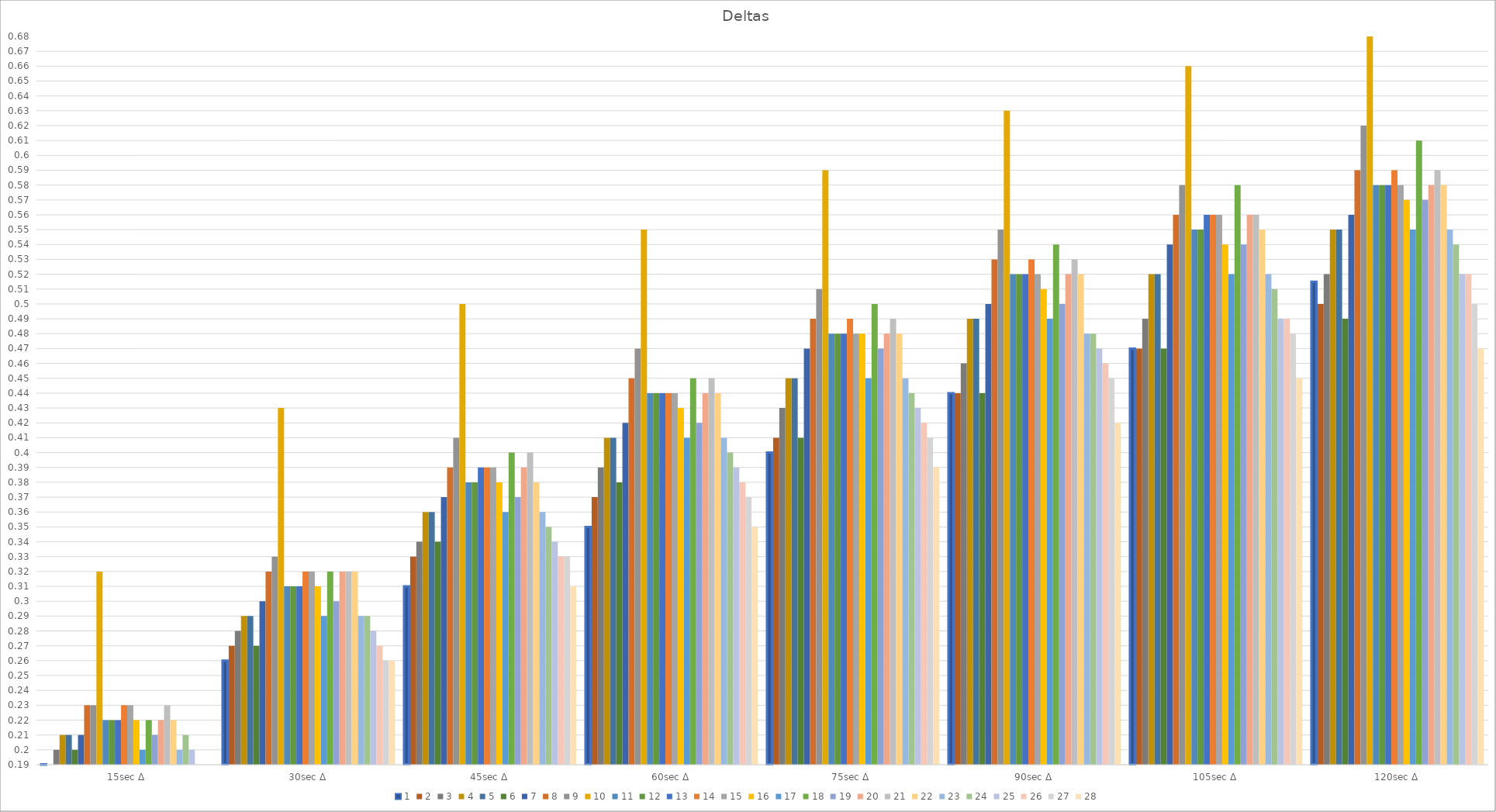
| Category | 1 | 2 | 3 | 4 | 5 | 6 | 7 | 8 | 9 | 10 | 11 | 12 | 13 | 14 | 15 | 16 | 17 | 18 | 19 | 20 | 21 | 22 | 23 | 24 | 25 | 26 | 27 | 28 |
|---|---|---|---|---|---|---|---|---|---|---|---|---|---|---|---|---|---|---|---|---|---|---|---|---|---|---|---|---|
| 15sec Δ | 0.19 | 0.19 | 0.2 | 0.21 | 0.21 | 0.2 | 0.21 | 0.23 | 0.23 | 0.32 | 0.22 | 0.22 | 0.22 | 0.23 | 0.23 | 0.22 | 0.2 | 0.22 | 0.21 | 0.22 | 0.23 | 0.22 | 0.2 | 0.21 | 0.2 | 0.19 | 0.19 | 0.19 |
| 30sec Δ | 0.26 | 0.27 | 0.28 | 0.29 | 0.29 | 0.27 | 0.3 | 0.32 | 0.33 | 0.43 | 0.31 | 0.31 | 0.31 | 0.32 | 0.32 | 0.31 | 0.29 | 0.32 | 0.3 | 0.32 | 0.32 | 0.32 | 0.29 | 0.29 | 0.28 | 0.27 | 0.26 | 0.26 |
| 45sec Δ | 0.31 | 0.33 | 0.34 | 0.36 | 0.36 | 0.34 | 0.37 | 0.39 | 0.41 | 0.5 | 0.38 | 0.38 | 0.39 | 0.39 | 0.39 | 0.38 | 0.36 | 0.4 | 0.37 | 0.39 | 0.4 | 0.38 | 0.36 | 0.35 | 0.34 | 0.33 | 0.33 | 0.31 |
| 60sec Δ | 0.35 | 0.37 | 0.39 | 0.41 | 0.41 | 0.38 | 0.42 | 0.45 | 0.47 | 0.55 | 0.44 | 0.44 | 0.44 | 0.44 | 0.44 | 0.43 | 0.41 | 0.45 | 0.42 | 0.44 | 0.45 | 0.44 | 0.41 | 0.4 | 0.39 | 0.38 | 0.37 | 0.35 |
| 75sec Δ  | 0.4 | 0.41 | 0.43 | 0.45 | 0.45 | 0.41 | 0.47 | 0.49 | 0.51 | 0.59 | 0.48 | 0.48 | 0.48 | 0.49 | 0.48 | 0.48 | 0.45 | 0.5 | 0.47 | 0.48 | 0.49 | 0.48 | 0.45 | 0.44 | 0.43 | 0.42 | 0.41 | 0.39 |
| 90sec Δ | 0.44 | 0.44 | 0.46 | 0.49 | 0.49 | 0.44 | 0.5 | 0.53 | 0.55 | 0.63 | 0.52 | 0.52 | 0.52 | 0.53 | 0.52 | 0.51 | 0.49 | 0.54 | 0.5 | 0.52 | 0.53 | 0.52 | 0.48 | 0.48 | 0.47 | 0.46 | 0.45 | 0.42 |
| 105sec Δ | 0.47 | 0.47 | 0.49 | 0.52 | 0.52 | 0.47 | 0.54 | 0.56 | 0.58 | 0.66 | 0.55 | 0.55 | 0.56 | 0.56 | 0.56 | 0.54 | 0.52 | 0.58 | 0.54 | 0.56 | 0.56 | 0.55 | 0.52 | 0.51 | 0.49 | 0.49 | 0.48 | 0.45 |
| 120sec Δ | 0.515 | 0.5 | 0.52 | 0.55 | 0.55 | 0.49 | 0.56 | 0.59 | 0.62 | 0.68 | 0.58 | 0.58 | 0.58 | 0.59 | 0.58 | 0.57 | 0.55 | 0.61 | 0.57 | 0.58 | 0.59 | 0.58 | 0.55 | 0.54 | 0.52 | 0.52 | 0.5 | 0.47 |